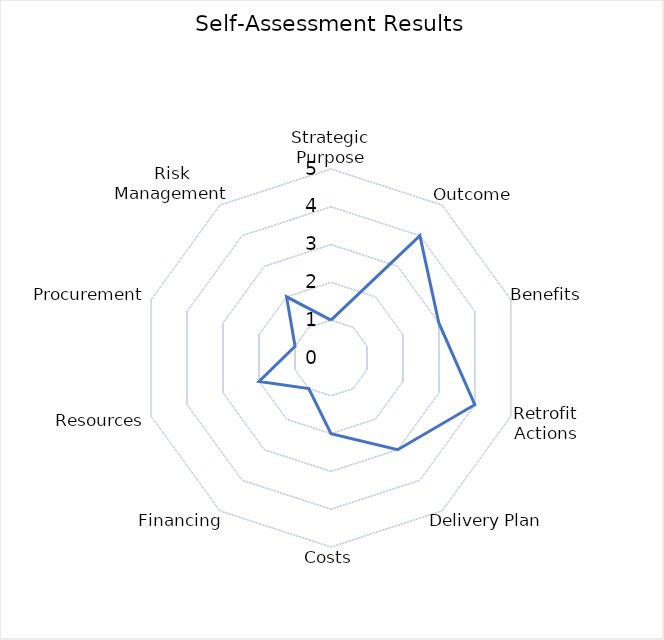
| Category | Series 0 |
|---|---|
| Strategic Purpose | 1 |
| Outcome | 4 |
| Benefits | 3 |
| Retrofit Actions | 4 |
| Delivery Plan | 3 |
| Costs | 2 |
| Financing | 1 |
| Resources | 2 |
| Procurement | 1 |
| Risk Management | 2 |